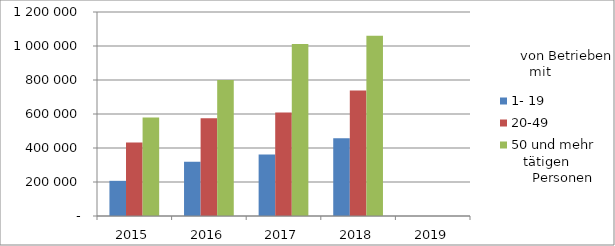
| Category | 1- 19 | 20-49 | 50 und mehr |
|---|---|---|---|
| 2015.0 | 206882.453 | 432377.754 | 578872.572 |
| 2016.0 | 319340.725 | 575670.955 | 800299.036 |
| 2017.0 | 362148.834 | 608159.206 | 1012092.607 |
| 2018.0 | 457961.358 | 737580.151 | 1061014.859 |
| 2019.0 | 0 | 0 | 0 |